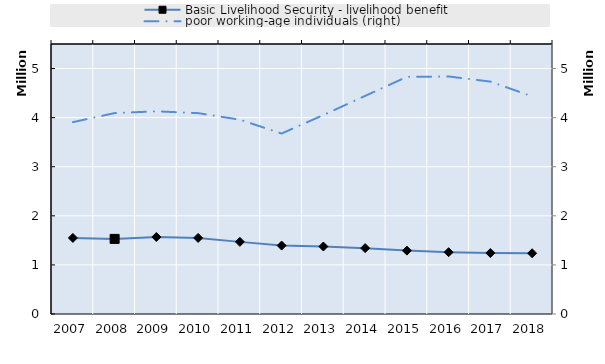
| Category | Basic Livelihood Security - livelihood benefit | Series 0 |
|---|---|---|
| 2007.0 | 1549848 |  |
| 2008.0 | 1529939 |  |
| 2009.0 | 1568533 |  |
| 2010.0 | 1549820 |  |
| 2011.0 | 1469254 |  |
| 2012.0 | 1394042 |  |
| 2013.0 | 1374585.25 |  |
| 2014.0 | 1341821.25 |  |
| 2015.0 | 1291068.5 |  |
| 2016.0 | 1259375.25 |  |
| 2017.0 | 1242055.75 |  |
| 2018.0 | 1237301.5 |  |